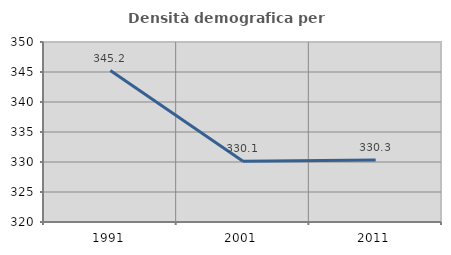
| Category | Densità demografica |
|---|---|
| 1991.0 | 345.236 |
| 2001.0 | 330.111 |
| 2011.0 | 330.338 |